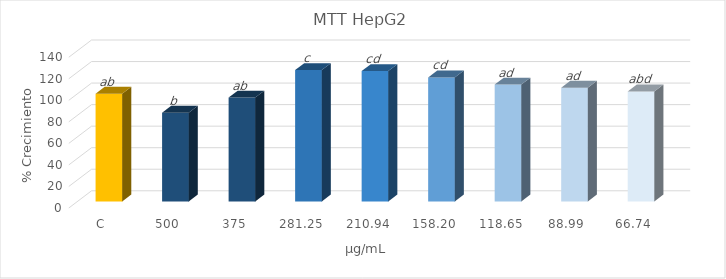
| Category | Series 0 |
|---|---|
| C | 100 |
| 500 | 82.421 |
| 375 | 96.458 |
| 281,25 | 121.958 |
| 210,94 | 121.056 |
| 158,20 | 115.132 |
| 118,65 | 108.564 |
| 88,99 | 105.602 |
| 66,74 | 102.125 |